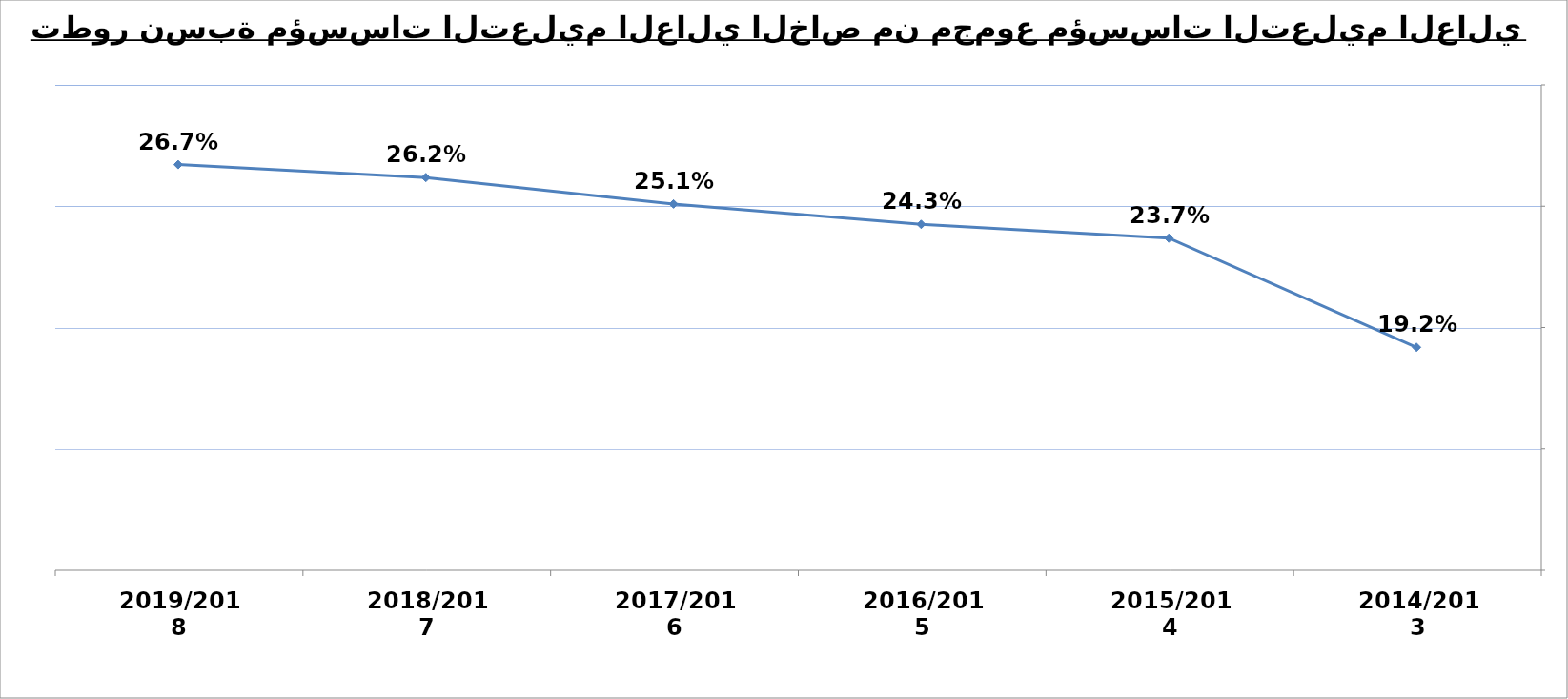
| Category | نسبة المؤسسات الخاصة |
|---|---|
| 2014/2013 | 0.192 |
| 2015/2014 | 0.237 |
| 2016/2015 | 0.243 |
| 2017/2016 | 0.251 |
| 2018/2017 | 0.262 |
| 2019/2018 | 0.267 |